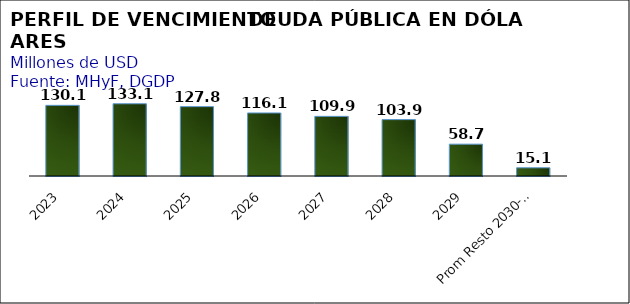
| Category | Series 0 |
|---|---|
| 2023 | 130.144 |
| 2024 | 133.067 |
| 2025 | 127.775 |
| 2026 | 116.133 |
| 2027 | 109.859 |
| 2028 | 103.87 |
| 2029 | 58.654 |
| Prom Resto 2030-2050 | 15.091 |